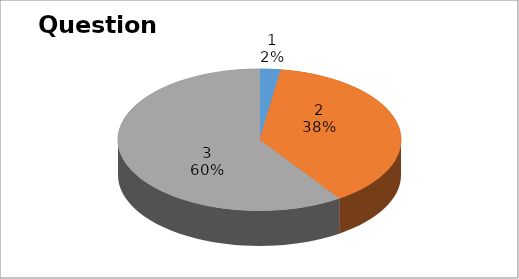
| Category | Series 0 |
|---|---|
| 0 | 1 |
| 1 | 16 |
| 2 | 25 |